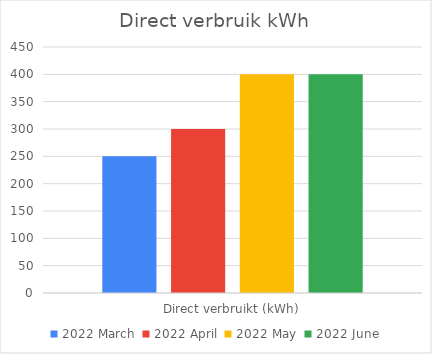
| Category | 2022 maart | 2022 april | 2022 mei | 2022 juni |
|---|---|---|---|---|
| Direct verbruikt (kWh) | 250 | 300 | 400 | 400 |